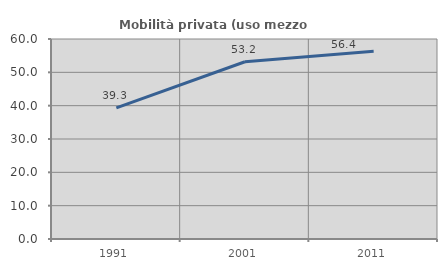
| Category | Mobilità privata (uso mezzo privato) |
|---|---|
| 1991.0 | 39.338 |
| 2001.0 | 53.18 |
| 2011.0 | 56.352 |